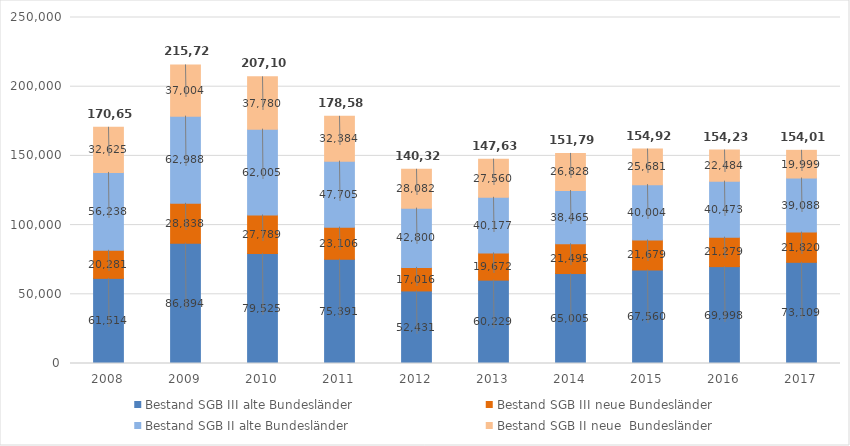
| Category | Bestand SGB III alte Bundesländer | Bestand SGB III neue Bundesländer | Bestand SGB II alte Bundesländer | Bestand SGB II neue  Bundesländer |
|---|---|---|---|---|
| 2008 | 61514 | 20281 | 56238 | 32625 |
| 2009 | 86894 | 28838 | 62988 | 37004 |
| 2010 | 79525 | 27789 | 62005 | 37780 |
| 2011 | 75391 | 23106 | 47705 | 32384 |
| 2012 | 52431 | 17016 | 42800 | 28082 |
| 2013 | 60229 | 19672 | 40177 | 27560 |
| 2014 | 65005 | 21495 | 38465 | 26828 |
| 2015 | 67560 | 21679 | 40004 | 25681 |
| 2016 | 69998 | 21279 | 40473 | 22484 |
| 2017 | 73109 | 21820 | 39088 | 19999 |